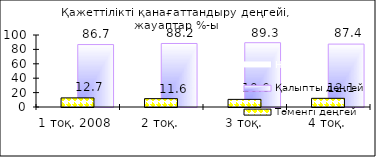
| Category | Не знаю | Қалыпты деңгей |
|---|---|---|
| 1 тоқ. 2008  | 0.64 | 86.7 |
| 2 тоқ. | 0.19 | 88.2 |
| 3 тоқ. | 0.12 | 89.29 |
| 4 тоқ. | 0.6 | 87.35 |